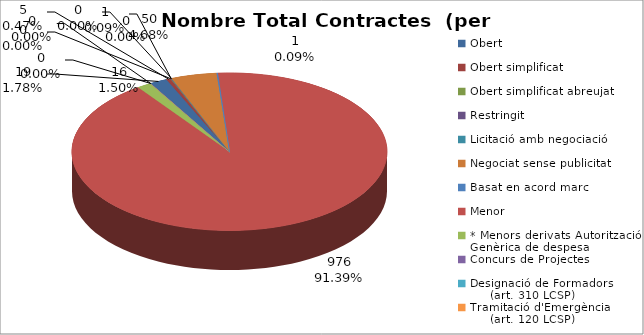
| Category | Nombre Total Contractes |
|---|---|
| Obert | 19 |
| Obert simplificat | 5 |
| Obert simplificat abreujat | 0 |
| Restringit | 1 |
| Licitació amb negociació | 0 |
| Negociat sense publicitat | 50 |
| Basat en acord marc | 1 |
| Menor | 976 |
| * Menors derivats Autorització Genèrica de despesa | 16 |
| Concurs de Projectes | 0 |
| Designació de Formadors
     (art. 310 LCSP) | 0 |
| Tramitació d'Emergència
     (art. 120 LCSP) | 0 |